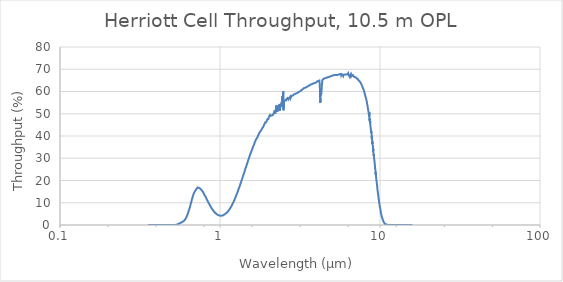
| Category | Throughput (%) |
|---|---|
| 0.355 | 0 |
| 0.365 | 0 |
| 0.375 | 0 |
| 0.385 | 0 |
| 0.395 | 0 |
| 0.405 | 0 |
| 0.415 | 0 |
| 0.425 | 0 |
| 0.435 | 0 |
| 0.445 | 0 |
| 0.455 | 0 |
| 0.465 | 0 |
| 0.475 | 0 |
| 0.485 | 0 |
| 0.495 | 0 |
| 0.505 | 0 |
| 0.515 | 0.002 |
| 0.525 | 0.031 |
| 0.535 | 0.14 |
| 0.545 | 0.35 |
| 0.555 | 0.617 |
| 0.565 | 0.894 |
| 0.575 | 1.171 |
| 0.585 | 1.481 |
| 0.595 | 1.883 |
| 0.605 | 2.477 |
| 0.615 | 3.335 |
| 0.625 | 4.483 |
| 0.635 | 5.9 |
| 0.645 | 7.512 |
| 0.655 | 9.22 |
| 0.665 | 10.995 |
| 0.675 | 12.688 |
| 0.685 | 14.096 |
| 0.695 | 14.979 |
| 0.705 | 15.73 |
| 0.715 | 16.127 |
| 0.725 | 16.89 |
| 0.735 | 16.753 |
| 0.745 | 16.546 |
| 0.755 | 16.311 |
| 0.765 | 15.822 |
| 0.775 | 15.239 |
| 0.785 | 14.701 |
| 0.795 | 13.931 |
| 0.805 | 13.139 |
| 0.815 | 12.527 |
| 0.825 | 11.699 |
| 0.835 | 10.95 |
| 0.845 | 10.209 |
| 0.855 | 9.512 |
| 0.865 | 8.82 |
| 0.875 | 8.225 |
| 0.885 | 7.606 |
| 0.895 | 7.089 |
| 0.905 | 6.58 |
| 0.915 | 6.14 |
| 0.925 | 5.75 |
| 0.935 | 5.394 |
| 0.945 | 5.085 |
| 0.955 | 4.828 |
| 0.965 | 4.617 |
| 0.975 | 4.452 |
| 0.985 | 4.326 |
| 0.995 | 4.242 |
| 1.005 | 4.181 |
| 1.015 | 4.166 |
| 1.025 | 4.184 |
| 1.035 | 4.219 |
| 1.045 | 4.318 |
| 1.055 | 4.609 |
| 1.065 | 4.746 |
| 1.075 | 4.923 |
| 1.085 | 5.125 |
| 1.095 | 5.35 |
| 1.105 | 5.607 |
| 1.115 | 5.902 |
| 1.125 | 6.212 |
| 1.135 | 6.617 |
| 1.145 | 7.002 |
| 1.155 | 7.391 |
| 1.165 | 7.841 |
| 1.175 | 8.292 |
| 1.185 | 8.799 |
| 1.195 | 9.324 |
| 1.205 | 9.877 |
| 1.215 | 10.403 |
| 1.225 | 10.954 |
| 1.235 | 11.48 |
| 1.245 | 12.135 |
| 1.255 | 12.787 |
| 1.265 | 13.429 |
| 1.275 | 14.004 |
| 1.285 | 14.664 |
| 1.295 | 15.378 |
| 1.305 | 16.025 |
| 1.315 | 16.696 |
| 1.325 | 17.288 |
| 1.335 | 17.999 |
| 1.345 | 18.711 |
| 1.355 | 19.321 |
| 1.365 | 20.124 |
| 1.375 | 20.7 |
| 1.385 | 21.493 |
| 1.395 | 22.303 |
| 1.405 | 22.748 |
| 1.415 | 23.447 |
| 1.425 | 24.099 |
| 1.435 | 24.889 |
| 1.445 | 25.581 |
| 1.455 | 26.1 |
| 1.465 | 26.801 |
| 1.475 | 27.467 |
| 1.485 | 28.038 |
| 1.495 | 28.786 |
| 1.505 | 29.348 |
| 1.515 | 29.931 |
| 1.525 | 30.647 |
| 1.535 | 31.094 |
| 1.545 | 31.713 |
| 1.555 | 32.141 |
| 1.565 | 32.878 |
| 1.575 | 33.106 |
| 1.585 | 33.778 |
| 1.595 | 34.276 |
| 1.605 | 35.043 |
| 1.615 | 35.122 |
| 1.625 | 35.779 |
| 1.635 | 36.249 |
| 1.645 | 36.573 |
| 1.655 | 37.429 |
| 1.665 | 37.652 |
| 1.675 | 37.72 |
| 1.685 | 38.638 |
| 1.695 | 38.591 |
| 1.705 | 39.022 |
| 1.715 | 39.441 |
| 1.725 | 40.033 |
| 1.735 | 40.137 |
| 1.745 | 40.683 |
| 1.755 | 41.013 |
| 1.765 | 41.536 |
| 1.775 | 41.844 |
| 1.785 | 42.045 |
| 1.795 | 42.28 |
| 1.805 | 42.497 |
| 1.815 | 42.706 |
| 1.825 | 42.772 |
| 1.835 | 43.385 |
| 1.845 | 43.613 |
| 1.855 | 43.903 |
| 1.865 | 44.225 |
| 1.875 | 44.589 |
| 1.885 | 44.631 |
| 1.895 | 45.298 |
| 1.905 | 45.165 |
| 1.915 | 46.052 |
| 1.925 | 46.426 |
| 1.935 | 46.071 |
| 1.945 | 46.173 |
| 1.955 | 46.478 |
| 1.965 | 46.474 |
| 1.975 | 47.49 |
| 1.985 | 47.084 |
| 1.995 | 47.652 |
| 2.005 | 47.608 |
| 2.015 | 48.159 |
| 2.025 | 48.671 |
| 2.035 | 48.735 |
| 2.045 | 49.045 |
| 2.055 | 49.522 |
| 2.065 | 49.286 |
| 2.075 | 49.312 |
| 2.085 | 49.068 |
| 2.095 | 49.488 |
| 2.105 | 49.417 |
| 2.115 | 49.344 |
| 2.125 | 49.272 |
| 2.135 | 49.58 |
| 2.145 | 49.29 |
| 2.155 | 49.842 |
| 2.165 | 50.169 |
| 2.175 | 49.792 |
| 2.185 | 50.789 |
| 2.195 | 51.398 |
| 2.205 | 51.053 |
| 2.215 | 50.07 |
| 2.225 | 51.731 |
| 2.235 | 51.045 |
| 2.245 | 50.768 |
| 2.255 | 53.727 |
| 2.265 | 50.956 |
| 2.275 | 52.141 |
| 2.285 | 51.089 |
| 2.295 | 52.728 |
| 2.305 | 52.562 |
| 2.315 | 53.229 |
| 2.325 | 51.937 |
| 2.335 | 52.761 |
| 2.345 | 53.357 |
| 2.355 | 54.118 |
| 2.365 | 51.442 |
| 2.375 | 52.176 |
| 2.385 | 54.454 |
| 2.395 | 54.749 |
| 2.405 | 54.561 |
| 2.415 | 53.223 |
| 2.425 | 53.392 |
| 2.435 | 55.285 |
| 2.445 | 53.714 |
| 2.455 | 57.946 |
| 2.465 | 55.768 |
| 2.475 | 57.915 |
| 2.485 | 60.158 |
| 2.495 | 51.623 |
| 2.505 | 55.692 |
| 2.515 | 55.685 |
| 2.525 | 55.687 |
| 2.535 | 56.004 |
| 2.545 | 55.945 |
| 2.555 | 56.029 |
| 2.565 | 56.153 |
| 2.575 | 56.142 |
| 2.585 | 55.974 |
| 2.595 | 56.533 |
| 2.61 | 56.21 |
| 2.619 | 56.486 |
| 2.63 | 56.752 |
| 2.64 | 57.015 |
| 2.65 | 56.878 |
| 2.659 | 56.94 |
| 2.67 | 56.41 |
| 2.68 | 55.963 |
| 2.689 | 56.376 |
| 2.7 | 57.015 |
| 2.71 | 57 |
| 2.719 | 57.432 |
| 2.73 | 57.027 |
| 2.739 | 56.779 |
| 2.749 | 57.702 |
| 2.76 | 57.012 |
| 2.769 | 57.293 |
| 2.78 | 57.525 |
| 2.789 | 57.447 |
| 2.8 | 57.928 |
| 2.809 | 58.07 |
| 2.82 | 57.976 |
| 2.829 | 58.137 |
| 2.839 | 58.211 |
| 2.849 | 58.301 |
| 2.859 | 58.252 |
| 2.87 | 58.409 |
| 2.879 | 58.498 |
| 2.889 | 58.624 |
| 2.899 | 58.613 |
| 2.909 | 58.736 |
| 2.919 | 58.688 |
| 2.929 | 58.766 |
| 2.939 | 58.863 |
| 2.949 | 58.779 |
| 2.959 | 58.955 |
| 2.969 | 59.175 |
| 2.979 | 59.074 |
| 2.989 | 59.137 |
| 2.999 | 59.149 |
| 3.009 | 59.188 |
| 3.019 | 59.325 |
| 3.029 | 59.228 |
| 3.039 | 59.356 |
| 3.049 | 59.472 |
| 3.059 | 59.415 |
| 3.069 | 59.553 |
| 3.079 | 59.53 |
| 3.089 | 59.662 |
| 3.099 | 59.73 |
| 3.109 | 59.788 |
| 3.119 | 59.94 |
| 3.129 | 59.894 |
| 3.139 | 59.974 |
| 3.149 | 60.016 |
| 3.159 | 60.084 |
| 3.169 | 60.184 |
| 3.179 | 60.305 |
| 3.189 | 60.261 |
| 3.199 | 60.218 |
| 3.209 | 60.4 |
| 3.219 | 60.511 |
| 3.229 | 60.594 |
| 3.239 | 60.655 |
| 3.249 | 60.787 |
| 3.259 | 60.874 |
| 3.269 | 60.848 |
| 3.279 | 60.975 |
| 3.289 | 60.977 |
| 3.299 | 61.068 |
| 3.309 | 61.148 |
| 3.319 | 61.138 |
| 3.329 | 61.212 |
| 3.339 | 61.271 |
| 3.349 | 61.429 |
| 3.359 | 61.594 |
| 3.369 | 61.488 |
| 3.379 | 61.506 |
| 3.389 | 61.631 |
| 3.399 | 61.623 |
| 3.409 | 61.652 |
| 3.419 | 61.649 |
| 3.429 | 61.608 |
| 3.439 | 61.802 |
| 3.449 | 61.829 |
| 3.459 | 61.956 |
| 3.469 | 62.012 |
| 3.479 | 62.163 |
| 3.489 | 62.092 |
| 3.499 | 62.146 |
| 3.509 | 62.173 |
| 3.519 | 62.229 |
| 3.529 | 62.121 |
| 3.539 | 62.293 |
| 3.549 | 62.478 |
| 3.559 | 62.586 |
| 3.569 | 62.454 |
| 3.579 | 62.537 |
| 3.589 | 62.554 |
| 3.599 | 62.573 |
| 3.609 | 62.64 |
| 3.619 | 62.784 |
| 3.629 | 62.821 |
| 3.639 | 62.786 |
| 3.649 | 62.941 |
| 3.659 | 62.912 |
| 3.669 | 62.917 |
| 3.679 | 62.918 |
| 3.689 | 63.105 |
| 3.699 | 63.185 |
| 3.709 | 63.217 |
| 3.719 | 63.281 |
| 3.729 | 63.408 |
| 3.739 | 63.321 |
| 3.749 | 63.247 |
| 3.759 | 63.3 |
| 3.769 | 63.465 |
| 3.779 | 63.384 |
| 3.789 | 63.475 |
| 3.799 | 63.483 |
| 3.809 | 63.576 |
| 3.819 | 63.548 |
| 3.829 | 63.654 |
| 3.839 | 63.628 |
| 3.849 | 63.701 |
| 3.859 | 63.8 |
| 3.869 | 63.738 |
| 3.879 | 63.815 |
| 3.889 | 63.829 |
| 3.899 | 63.956 |
| 3.909 | 63.997 |
| 3.919 | 63.954 |
| 3.929 | 63.83 |
| 3.939 | 63.88 |
| 3.949 | 63.923 |
| 3.959 | 64.061 |
| 3.968 | 64.146 |
| 3.979 | 64.196 |
| 3.989 | 64.105 |
| 3.999 | 64.15 |
| 4.009 | 64.27 |
| 4.018 | 64.267 |
| 4.029 | 64.469 |
| 4.039 | 64.391 |
| 4.049 | 64.409 |
| 4.058 | 64.583 |
| 4.069 | 64.571 |
| 4.078 | 64.566 |
| 4.089 | 64.475 |
| 4.098 | 64.59 |
| 4.109 | 64.623 |
| 4.118 | 64.735 |
| 4.129 | 64.794 |
| 4.138 | 64.884 |
| 4.148 | 64.825 |
| 4.159 | 64.989 |
| 4.168 | 64.928 |
| 4.178 | 64.923 |
| 4.189 | 64.532 |
| 4.198 | 63.471 |
| 4.208 | 61.988 |
| 4.218 | 60.317 |
| 4.228 | 55.672 |
| 4.238 | 54.973 |
| 4.248 | 56.489 |
| 4.258 | 59.579 |
| 4.268 | 58.262 |
| 4.278 | 58.218 |
| 4.288 | 58.511 |
| 4.298 | 59.424 |
| 4.308 | 60.246 |
| 4.318 | 61.047 |
| 4.328 | 62.56 |
| 4.338 | 63.37 |
| 4.348 | 63.9 |
| 4.358 | 64.941 |
| 4.368 | 65.204 |
| 4.378 | 65.274 |
| 4.388 | 65.416 |
| 4.398 | 65.657 |
| 4.408 | 65.565 |
| 4.418 | 65.541 |
| 4.428 | 65.6 |
| 4.438 | 65.636 |
| 4.448 | 65.697 |
| 4.458 | 65.764 |
| 4.468 | 65.881 |
| 4.478 | 65.82 |
| 4.488 | 65.765 |
| 4.498 | 65.858 |
| 4.508 | 65.886 |
| 4.518 | 65.943 |
| 4.528 | 65.984 |
| 4.538 | 66.009 |
| 4.548 | 66.014 |
| 4.558 | 65.95 |
| 4.568 | 66.076 |
| 4.578 | 66.055 |
| 4.588 | 66.085 |
| 4.598 | 66.064 |
| 4.608 | 66.042 |
| 4.618 | 66.08 |
| 4.628 | 66.155 |
| 4.638 | 66.144 |
| 4.648 | 66.319 |
| 4.658 | 66.38 |
| 4.668 | 66.267 |
| 4.678 | 66.25 |
| 4.688 | 66.263 |
| 4.698 | 66.32 |
| 4.708 | 66.28 |
| 4.718 | 66.355 |
| 4.728 | 66.432 |
| 4.738 | 66.492 |
| 4.748 | 66.514 |
| 4.758 | 66.512 |
| 4.768 | 66.637 |
| 4.778 | 66.627 |
| 4.788 | 66.547 |
| 4.798 | 66.633 |
| 4.808 | 66.558 |
| 4.818 | 66.597 |
| 4.828 | 66.645 |
| 4.838 | 66.687 |
| 4.848 | 66.659 |
| 4.858 | 66.654 |
| 4.868 | 66.756 |
| 4.878 | 66.749 |
| 4.888 | 66.749 |
| 4.898 | 66.73 |
| 4.908 | 66.899 |
| 4.918 | 66.889 |
| 4.928 | 66.861 |
| 4.938 | 66.927 |
| 4.948 | 66.94 |
| 4.958 | 66.915 |
| 4.968 | 66.937 |
| 4.978 | 66.95 |
| 4.988 | 66.97 |
| 4.998 | 66.914 |
| 5.008 | 66.875 |
| 5.018 | 66.946 |
| 5.028 | 66.995 |
| 5.038 | 67.185 |
| 5.048 | 67.191 |
| 5.058 | 67.165 |
| 5.068 | 67.156 |
| 5.078 | 67.066 |
| 5.088 | 67.094 |
| 5.098 | 67.187 |
| 5.107 | 67.323 |
| 5.118 | 67.258 |
| 5.128 | 67.21 |
| 5.138 | 67.248 |
| 5.147 | 67.155 |
| 5.158 | 67.217 |
| 5.168 | 67.27 |
| 5.178 | 67.287 |
| 5.187 | 67.404 |
| 5.198 | 67.426 |
| 5.208 | 67.292 |
| 5.218 | 67.369 |
| 5.227 | 67.414 |
| 5.238 | 67.388 |
| 5.248 | 67.452 |
| 5.257 | 67.469 |
| 5.268 | 67.418 |
| 5.278 | 67.39 |
| 5.288 | 67.392 |
| 5.297 | 67.387 |
| 5.308 | 67.557 |
| 5.318 | 67.543 |
| 5.327 | 67.539 |
| 5.337 | 67.593 |
| 5.348 | 67.39 |
| 5.358 | 67.378 |
| 5.367 | 67.527 |
| 5.378 | 67.689 |
| 5.388 | 67.699 |
| 5.397 | 67.664 |
| 5.407 | 67.548 |
| 5.418 | 67.437 |
| 5.428 | 67.325 |
| 5.437 | 67.425 |
| 5.448 | 67.668 |
| 5.458 | 67.628 |
| 5.467 | 67.443 |
| 5.477 | 67.438 |
| 5.488 | 67.549 |
| 5.497 | 67.652 |
| 5.507 | 67.695 |
| 5.518 | 67.641 |
| 5.527 | 67.687 |
| 5.537 | 67.799 |
| 5.548 | 67.703 |
| 5.558 | 67.603 |
| 5.567 | 67.66 |
| 5.578 | 67.556 |
| 5.588 | 67.66 |
| 5.597 | 67.809 |
| 5.608 | 67.815 |
| 5.618 | 67.824 |
| 5.627 | 67.882 |
| 5.637 | 67.832 |
| 5.648 | 67.528 |
| 5.657 | 67.599 |
| 5.667 | 67.732 |
| 5.678 | 67.762 |
| 5.687 | 67.737 |
| 5.697 | 67.849 |
| 5.707 | 67.848 |
| 5.717 | 67.337 |
| 5.727 | 67.422 |
| 5.737 | 67.617 |
| 5.747 | 67.798 |
| 5.758 | 67.835 |
| 5.767 | 67.643 |
| 5.777 | 67.435 |
| 5.788 | 67.772 |
| 5.797 | 67.933 |
| 5.807 | 68.037 |
| 5.818 | 67.71 |
| 5.827 | 67.416 |
| 5.837 | 67.506 |
| 5.847 | 67.897 |
| 5.857 | 67.833 |
| 5.867 | 67.678 |
| 5.877 | 67.492 |
| 5.887 | 67.013 |
| 5.898 | 67.177 |
| 5.907 | 67.491 |
| 5.917 | 67.689 |
| 5.927 | 67.608 |
| 5.937 | 67.347 |
| 5.947 | 67.178 |
| 5.957 | 67.632 |
| 5.967 | 67.726 |
| 5.978 | 67.715 |
| 5.987 | 67.567 |
| 5.997 | 67.588 |
| 6.007 | 67.684 |
| 6.017 | 67.654 |
| 6.027 | 67.825 |
| 6.037 | 68 |
| 6.047 | 67.854 |
| 6.057 | 67.244 |
| 6.067 | 67.209 |
| 6.077 | 67.23 |
| 6.087 | 67.675 |
| 6.097 | 67.794 |
| 6.107 | 67.685 |
| 6.117 | 67.362 |
| 6.127 | 67.451 |
| 6.137 | 67.569 |
| 6.147 | 67.542 |
| 6.157 | 67.42 |
| 6.167 | 67.532 |
| 6.177 | 67.674 |
| 6.187 | 67.572 |
| 6.197 | 67.603 |
| 6.207 | 67.664 |
| 6.217 | 67.666 |
| 6.227 | 67.729 |
| 6.237 | 67.801 |
| 6.247 | 67.87 |
| 6.257 | 67.884 |
| 6.267 | 67.751 |
| 6.277 | 67.606 |
| 6.287 | 67.555 |
| 6.297 | 67.706 |
| 6.307 | 67.908 |
| 6.317 | 68.154 |
| 6.327 | 68.206 |
| 6.337 | 67.919 |
| 6.347 | 67.609 |
| 6.357 | 67.692 |
| 6.367 | 67.693 |
| 6.377 | 67.632 |
| 6.387 | 67.695 |
| 6.397 | 67.955 |
| 6.407 | 67.765 |
| 6.417 | 67.194 |
| 6.427 | 66.952 |
| 6.437 | 67.149 |
| 6.446 | 67.336 |
| 6.457 | 67.638 |
| 6.467 | 67.648 |
| 6.477 | 67.514 |
| 6.487 | 67.243 |
| 6.497 | 66.966 |
| 6.507 | 67.129 |
| 6.517 | 67.247 |
| 6.527 | 67.339 |
| 6.537 | 67.428 |
| 6.547 | 67.442 |
| 6.557 | 67.357 |
| 6.567 | 67.02 |
| 6.577 | 66.869 |
| 6.587 | 66.862 |
| 6.597 | 67.158 |
| 6.607 | 67.326 |
| 6.617 | 67.403 |
| 6.627 | 67.009 |
| 6.637 | 66.716 |
| 6.647 | 66.823 |
| 6.657 | 67.114 |
| 6.666 | 67.358 |
| 6.677 | 67.298 |
| 6.686 | 67.286 |
| 6.697 | 67.343 |
| 6.706 | 67.209 |
| 6.717 | 67.043 |
| 6.726 | 67.094 |
| 6.737 | 67.47 |
| 6.746 | 67.549 |
| 6.757 | 67.554 |
| 6.766 | 67.399 |
| 6.777 | 67.216 |
| 6.787 | 67.028 |
| 6.797 | 67.164 |
| 6.807 | 67.314 |
| 6.816 | 67.368 |
| 6.827 | 67.305 |
| 6.836 | 67.217 |
| 6.847 | 67.181 |
| 6.856 | 66.971 |
| 6.867 | 66.661 |
| 6.876 | 66.78 |
| 6.887 | 66.951 |
| 6.897 | 67.012 |
| 6.906 | 66.88 |
| 6.917 | 66.836 |
| 6.926 | 66.853 |
| 6.937 | 66.944 |
| 6.946 | 66.863 |
| 6.956 | 66.685 |
| 6.967 | 66.482 |
| 6.976 | 66.534 |
| 6.987 | 66.583 |
| 6.996 | 66.558 |
| 7.007 | 66.504 |
| 7.016 | 66.457 |
| 7.026 | 66.387 |
| 7.037 | 66.237 |
| 7.046 | 66.146 |
| 7.057 | 66.103 |
| 7.066 | 66.26 |
| 7.076 | 66.299 |
| 7.087 | 66.294 |
| 7.096 | 66.251 |
| 7.107 | 66.161 |
| 7.116 | 66.133 |
| 7.126 | 66.115 |
| 7.137 | 66.036 |
| 7.146 | 65.913 |
| 7.156 | 65.828 |
| 7.166 | 65.801 |
| 7.176 | 65.911 |
| 7.187 | 65.93 |
| 7.196 | 65.904 |
| 7.206 | 65.776 |
| 7.217 | 65.755 |
| 7.226 | 65.779 |
| 7.236 | 65.865 |
| 7.246 | 65.806 |
| 7.256 | 65.713 |
| 7.266 | 65.608 |
| 7.276 | 65.523 |
| 7.286 | 65.543 |
| 7.296 | 65.579 |
| 7.306 | 65.616 |
| 7.316 | 65.51 |
| 7.327 | 65.369 |
| 7.336 | 65.204 |
| 7.346 | 65.04 |
| 7.357 | 65.011 |
| 7.366 | 65.019 |
| 7.376 | 65.073 |
| 7.386 | 65.072 |
| 7.396 | 65.09 |
| 7.406 | 65.113 |
| 7.416 | 65.047 |
| 7.426 | 64.965 |
| 7.436 | 64.875 |
| 7.446 | 64.722 |
| 7.456 | 64.555 |
| 7.466 | 64.399 |
| 7.476 | 64.337 |
| 7.486 | 64.377 |
| 7.496 | 64.396 |
| 7.506 | 64.387 |
| 7.516 | 64.291 |
| 7.526 | 64.192 |
| 7.536 | 64.115 |
| 7.546 | 64.094 |
| 7.556 | 64.041 |
| 7.566 | 63.965 |
| 7.576 | 63.879 |
| 7.586 | 63.807 |
| 7.596 | 63.733 |
| 7.606 | 63.654 |
| 7.616 | 63.559 |
| 7.626 | 63.462 |
| 7.636 | 63.373 |
| 7.646 | 63.329 |
| 7.656 | 63.263 |
| 7.666 | 63.151 |
| 7.676 | 62.983 |
| 7.686 | 62.877 |
| 7.696 | 62.809 |
| 7.706 | 62.755 |
| 7.716 | 62.729 |
| 7.726 | 62.628 |
| 7.736 | 62.498 |
| 7.746 | 62.326 |
| 7.756 | 62.214 |
| 7.766 | 62.112 |
| 7.776 | 62.024 |
| 7.786 | 61.919 |
| 7.796 | 61.802 |
| 7.806 | 61.675 |
| 7.816 | 61.554 |
| 7.826 | 61.473 |
| 7.836 | 61.406 |
| 7.846 | 61.398 |
| 7.855 | 61.328 |
| 7.866 | 61.236 |
| 7.876 | 61.132 |
| 7.886 | 60.977 |
| 7.896 | 60.793 |
| 7.905 | 60.616 |
| 7.916 | 60.421 |
| 7.926 | 60.28 |
| 7.936 | 60.161 |
| 7.946 | 60.055 |
| 7.955 | 60.005 |
| 7.966 | 59.9 |
| 7.976 | 59.78 |
| 7.986 | 59.671 |
| 7.996 | 59.54 |
| 8.005 | 59.404 |
| 8.016 | 59.224 |
| 8.026 | 59.058 |
| 8.036 | 58.895 |
| 8.046 | 58.744 |
| 8.056 | 58.613 |
| 8.065 | 58.49 |
| 8.075 | 58.362 |
| 8.086 | 58.231 |
| 8.096 | 58.055 |
| 8.106 | 57.871 |
| 8.116 | 57.686 |
| 8.125 | 57.55 |
| 8.135 | 57.418 |
| 8.146 | 57.294 |
| 8.156 | 57.233 |
| 8.166 | 57.107 |
| 8.176 | 56.98 |
| 8.186 | 56.85 |
| 8.195 | 56.698 |
| 8.205 | 56.548 |
| 8.215 | 56.38 |
| 8.226 | 56.162 |
| 8.236 | 55.928 |
| 8.246 | 55.691 |
| 8.256 | 55.531 |
| 8.266 | 55.383 |
| 8.275 | 55.232 |
| 8.285 | 55.065 |
| 8.295 | 54.834 |
| 8.305 | 54.587 |
| 8.315 | 54.352 |
| 8.326 | 54.131 |
| 8.336 | 53.923 |
| 8.346 | 53.728 |
| 8.356 | 53.516 |
| 8.366 | 53.271 |
| 8.375 | 53.055 |
| 8.385 | 52.806 |
| 8.395 | 52.586 |
| 8.405 | 52.378 |
| 8.415 | 52.183 |
| 8.425 | 52.014 |
| 8.435 | 51.784 |
| 8.445 | 51.553 |
| 8.455 | 51.275 |
| 8.465 | 51.039 |
| 8.476 | 50.786 |
| 8.486 | 50.545 |
| 8.496 | 50.317 |
| 8.506 | 50.086 |
| 8.516 | 50.191 |
| 8.526 | 50.265 |
| 8.536 | 49.365 |
| 8.555 | 48.904 |
| 8.565 | 50.666 |
| 8.575 | 48.77 |
| 8.585 | 48.494 |
| 8.595 | 47.761 |
| 8.605 | 47.39 |
| 8.615 | 46.991 |
| 8.625 | 47.887 |
| 8.635 | 46.948 |
| 8.645 | 46.279 |
| 8.655 | 45.703 |
| 8.665 | 46.161 |
| 8.675 | 46.808 |
| 8.685 | 46.282 |
| 8.695 | 45.426 |
| 8.705 | 44.888 |
| 8.715 | 45.153 |
| 8.735 | 43.926 |
| 8.745 | 43.53 |
| 8.755 | 43.332 |
| 8.765 | 43.589 |
| 8.775 | 42.848 |
| 8.785 | 42.623 |
| 8.795 | 42.364 |
| 8.805 | 41.356 |
| 8.815 | 42.025 |
| 8.825 | 41.724 |
| 8.835 | 41.55 |
| 8.845 | 41.631 |
| 8.855 | 41.813 |
| 8.865 | 40.604 |
| 8.875 | 39.854 |
| 8.885 | 38.945 |
| 8.895 | 39.79 |
| 8.905 | 38.778 |
| 8.925 | 38.572 |
| 8.935 | 37.9 |
| 8.945 | 38.168 |
| 8.955 | 36.475 |
| 8.965 | 37.433 |
| 8.975 | 37.62 |
| 8.985 | 36.488 |
| 8.995 | 35.915 |
| 9.005 | 36.071 |
| 9.015 | 35.686 |
| 9.035 | 35.418 |
| 9.045 | 34.972 |
| 9.055 | 34.245 |
| 9.065 | 33.606 |
| 9.075 | 34.129 |
| 9.085 | 32.803 |
| 9.095 | 33.179 |
| 9.115 | 31.851 |
| 9.125 | 32.211 |
| 9.135 | 31.802 |
| 9.145 | 31.09 |
| 9.155 | 31.711 |
| 9.175 | 30.494 |
| 9.185 | 30.704 |
| 9.195 | 29.652 |
| 9.205 | 29.376 |
| 9.215 | 29.123 |
| 9.235 | 28.87 |
| 9.245 | 28.698 |
| 9.255 | 28.071 |
| 9.265 | 27.876 |
| 9.275 | 27.293 |
| 9.295 | 26.682 |
| 9.305 | 25.901 |
| 9.314 | 25.877 |
| 9.325 | 25.397 |
| 9.345 | 25.073 |
| 9.355 | 24.811 |
| 9.364 | 24.732 |
| 9.375 | 23.691 |
| 9.385 | 23.993 |
| 9.395 | 23.202 |
| 9.404 | 23.086 |
| 9.415 | 23.659 |
| 9.425 | 22.438 |
| 9.435 | 22.774 |
| 9.444 | 22.304 |
| 9.455 | 22.119 |
| 9.465 | 21.202 |
| 9.475 | 20.657 |
| 9.484 | 20.757 |
| 9.495 | 20.165 |
| 9.505 | 20.276 |
| 9.515 | 19.846 |
| 9.524 | 20.352 |
| 9.535 | 19.438 |
| 9.545 | 19.592 |
| 9.554 | 19.131 |
| 9.564 | 18.445 |
| 9.575 | 18.098 |
| 9.585 | 18.071 |
| 9.594 | 17.675 |
| 9.605 | 17.108 |
| 9.615 | 17.03 |
| 9.624 | 16.373 |
| 9.634 | 16.267 |
| 9.645 | 15.75 |
| 9.654 | 15.881 |
| 9.664 | 16.055 |
| 9.675 | 15.217 |
| 9.684 | 15.506 |
| 9.694 | 14.677 |
| 9.705 | 14.611 |
| 9.714 | 14.595 |
| 9.724 | 14.103 |
| 9.735 | 13.636 |
| 9.744 | 13.211 |
| 9.754 | 13.635 |
| 9.765 | 13.08 |
| 9.774 | 12.722 |
| 9.784 | 12.474 |
| 9.795 | 11.96 |
| 9.804 | 12.213 |
| 9.815 | 11.814 |
| 9.824 | 11.528 |
| 9.834 | 11.534 |
| 9.845 | 11.263 |
| 9.854 | 11.088 |
| 9.864 | 10.564 |
| 9.875 | 10.109 |
| 9.884 | 10.279 |
| 9.895 | 9.852 |
| 9.904 | 9.805 |
| 9.914 | 9.822 |
| 9.924 | 9.346 |
| 9.934 | 9.162 |
| 9.945 | 8.88 |
| 9.954 | 8.775 |
| 9.964 | 8.287 |
| 9.974 | 8.224 |
| 9.984 | 7.916 |
| 9.994 | 8.038 |
| 10.004 | 8.001 |
| 10.015 | 7.728 |
| 10.024 | 7.896 |
| 10.034 | 7.344 |
| 10.044 | 7.437 |
| 10.054 | 7.134 |
| 10.064 | 6.775 |
| 10.074 | 6.683 |
| 10.084 | 6.53 |
| 10.094 | 6.228 |
| 10.104 | 6.249 |
| 10.114 | 5.649 |
| 10.124 | 5.881 |
| 10.134 | 5.623 |
| 10.144 | 5.464 |
| 10.154 | 5.187 |
| 10.164 | 5.259 |
| 10.174 | 5.124 |
| 10.184 | 5.177 |
| 10.194 | 4.663 |
| 10.204 | 4.666 |
| 10.214 | 4.514 |
| 10.224 | 4.357 |
| 10.234 | 4.14 |
| 10.244 | 3.947 |
| 10.254 | 4.088 |
| 10.264 | 3.996 |
| 10.274 | 3.675 |
| 10.284 | 3.731 |
| 10.294 | 3.705 |
| 10.304 | 3.419 |
| 10.314 | 3.249 |
| 10.324 | 3.258 |
| 10.334 | 3.177 |
| 10.344 | 2.941 |
| 10.354 | 2.89 |
| 10.364 | 2.695 |
| 10.374 | 2.834 |
| 10.384 | 2.717 |
| 10.394 | 2.558 |
| 10.404 | 2.427 |
| 10.414 | 2.579 |
| 10.424 | 2.273 |
| 10.434 | 2.265 |
| 10.444 | 2.089 |
| 10.454 | 1.983 |
| 10.464 | 1.997 |
| 10.474 | 1.935 |
| 10.484 | 1.918 |
| 10.494 | 1.716 |
| 10.504 | 1.627 |
| 10.514 | 1.689 |
| 10.524 | 1.661 |
| 10.534 | 1.488 |
| 10.544 | 1.42 |
| 10.554 | 1.437 |
| 10.564 | 1.202 |
| 10.574 | 1.23 |
| 10.584 | 1.25 |
| 10.594 | 1.22 |
| 10.604 | 1.05 |
| 10.614 | 0.971 |
| 10.624 | 1.102 |
| 10.634 | 1.056 |
| 10.644 | 0.941 |
| 10.654 | 0.941 |
| 10.664 | 0.838 |
| 10.674 | 0.901 |
| 10.684 | 0.766 |
| 10.694 | 0.708 |
| 10.704 | 0.741 |
| 10.714 | 0.776 |
| 10.723 | 0.632 |
| 10.734 | 0.535 |
| 10.744 | 0.553 |
| 10.754 | 0.506 |
| 10.763 | 0.537 |
| 10.774 | 0.565 |
| 10.784 | 0.424 |
| 10.794 | 0.491 |
| 10.803 | 0.401 |
| 10.814 | 0.399 |
| 10.824 | 0.347 |
| 10.834 | 0.364 |
| 10.843 | 0.371 |
| 10.854 | 0.333 |
| 10.864 | 0.269 |
| 10.874 | 0.254 |
| 10.883 | 0.29 |
| 10.893 | 0.326 |
| 10.904 | 0.222 |
| 10.914 | 0.261 |
| 10.924 | 0.212 |
| 10.933 | 0.2 |
| 10.943 | 0.19 |
| 10.954 | 0.181 |
| 10.964 | 0.172 |
| 10.974 | 0.163 |
| 10.984 | 0.155 |
| 10.993 | 0.148 |
| 11.003 | 0.14 |
| 11.014 | 0.133 |
| 11.024 | 0.126 |
| 11.034 | 0.12 |
| 11.044 | 0.113 |
| 11.053 | 0.108 |
| 11.063 | 0.102 |
| 11.073 | 0.097 |
| 11.083 | 0.091 |
| 11.094 | 0.086 |
| 11.104 | 0.082 |
| 11.114 | 0.077 |
| 11.124 | 0.073 |
| 11.133 | 0.069 |
| 11.143 | 0.066 |
| 11.153 | 0.062 |
| 11.163 | 0.059 |
| 11.173 | 0.055 |
| 11.183 | 0.052 |
| 11.193 | 0.049 |
| 11.204 | 0.046 |
| 11.214 | 0.044 |
| 11.224 | 0.041 |
| 11.234 | 0.038 |
| 11.244 | 0.036 |
| 11.254 | 0.034 |
| 11.264 | 0.032 |
| 11.273 | 0.03 |
| 11.283 | 0.028 |
| 11.293 | 0.027 |
| 11.303 | 0.025 |
| 11.313 | 0.024 |
| 11.323 | 0.022 |
| 11.333 | 0.021 |
| 11.343 | 0.019 |
| 11.353 | 0.018 |
| 11.363 | 0.017 |
| 11.373 | 0.016 |
| 11.383 | 0.015 |
| 11.393 | 0.014 |
| 11.403 | 0.013 |
| 11.413 | 0.012 |
| 11.423 | 0.011 |
| 11.433 | 0.011 |
| 11.443 | 0.01 |
| 11.453 | 0.009 |
| 11.464 | 0.008 |
| 11.474 | 0.008 |
| 11.483 | 0.007 |
| 11.493 | 0.007 |
| 11.503 | 0.006 |
| 11.513 | 0.006 |
| 11.523 | 0.005 |
| 11.533 | 0.005 |
| 11.543 | 0.005 |
| 11.553 | 0.004 |
| 11.563 | 0.004 |
| 11.573 | 0.004 |
| 11.583 | 0.003 |
| 11.593 | 0.003 |
| 11.603 | 0.003 |
| 11.613 | 0.003 |
| 11.623 | 0.002 |
| 11.633 | 0.002 |
| 11.643 | 0.002 |
| 11.653 | 0.002 |
| 11.663 | 0.002 |
| 11.673 | 0.001 |
| 11.683 | 0.001 |
| 11.693 | 0.001 |
| 11.703 | 0.001 |
| 11.713 | 0.001 |
| 11.723 | 0.001 |
| 11.733 | 0.001 |
| 11.743 | 0.001 |
| 11.753 | 0.001 |
| 11.763 | 0.001 |
| 11.773 | 0.001 |
| 11.783 | 0 |
| 11.793 | 0 |
| 11.803 | 0 |
| 11.813 | 0 |
| 11.823 | 0 |
| 11.833 | 0 |
| 11.843 | 0 |
| 11.853 | 0 |
| 11.863 | 0 |
| 11.873 | 0 |
| 11.883 | 0 |
| 11.893 | 0 |
| 11.903 | 0 |
| 11.913 | 0 |
| 11.923 | 0 |
| 11.933 | 0 |
| 11.943 | 0 |
| 11.953 | 0 |
| 11.963 | 0 |
| 11.973 | 0 |
| 11.983 | 0 |
| 11.993 | 0 |
| 12.003 | 0 |
| 12.013 | 0 |
| 12.023 | 0 |
| 12.033 | 0 |
| 12.043 | 0 |
| 12.053 | 0 |
| 12.063 | 0 |
| 12.073 | 0 |
| 12.083 | 0 |
| 12.093 | 0 |
| 12.103 | 0 |
| 12.113 | 0 |
| 12.122 | 0 |
| 12.133 | 0 |
| 12.143 | 0 |
| 12.153 | 0 |
| 12.163 | 0 |
| 12.172 | 0 |
| 12.183 | 0 |
| 12.193 | 0 |
| 12.203 | 0 |
| 12.213 | 0 |
| 12.223 | 0 |
| 12.233 | 0 |
| 12.242 | 0 |
| 12.253 | 0 |
| 12.262 | 0 |
| 12.273 | 0 |
| 12.282 | 0 |
| 12.293 | 0 |
| 12.302 | 0 |
| 12.313 | 0 |
| 12.323 | 0 |
| 12.333 | 0 |
| 12.342 | 0 |
| 12.353 | 0 |
| 12.362 | 0 |
| 12.373 | 0 |
| 12.382 | 0 |
| 12.393 | 0 |
| 12.402 | 0 |
| 12.413 | 0 |
| 12.422 | 0 |
| 12.433 | 0 |
| 12.442 | 0 |
| 12.452 | 0 |
| 12.463 | 0 |
| 12.472 | 0 |
| 12.483 | 0 |
| 12.492 | 0 |
| 12.503 | 0 |
| 12.513 | 0 |
| 12.522 | 0 |
| 12.533 | 0 |
| 12.542 | 0 |
| 12.552 | 0 |
| 12.563 | 0 |
| 12.572 | 0 |
| 12.583 | 0 |
| 12.593 | 0 |
| 12.602 | 0 |
| 12.613 | 0 |
| 12.622 | 0 |
| 12.632 | 0 |
| 12.643 | 0 |
| 12.653 | 0 |
| 12.662 | 0 |
| 12.672 | 0 |
| 12.683 | 0 |
| 12.692 | 0 |
| 12.702 | 0 |
| 12.713 | 0 |
| 12.722 | 0 |
| 12.732 | 0 |
| 12.742 | 0 |
| 12.753 | 0 |
| 12.762 | 0 |
| 12.772 | 0 |
| 12.782 | 0 |
| 12.793 | 0 |
| 12.802 | 0 |
| 12.812 | 0 |
| 12.822 | 0 |
| 12.832 | 0 |
| 12.843 | 0 |
| 12.852 | 0 |
| 12.862 | 0 |
| 12.872 | 0 |
| 12.882 | 0 |
| 12.892 | 0 |
| 12.902 | 0 |
| 12.912 | 0 |
| 12.922 | 0 |
| 12.932 | 0 |
| 12.942 | 0 |
| 12.952 | 0 |
| 12.962 | 0 |
| 12.972 | 0 |
| 12.982 | 0 |
| 12.992 | 0 |
| 13.002 | 0 |
| 13.012 | 0 |
| 13.022 | 0 |
| 13.032 | 0 |
| 13.042 | 0 |
| 13.052 | 0 |
| 13.062 | 0 |
| 13.072 | 0 |
| 13.082 | 0 |
| 13.092 | 0 |
| 13.102 | 0 |
| 13.112 | 0 |
| 13.122 | 0 |
| 13.132 | 0 |
| 13.142 | 0 |
| 13.152 | 0 |
| 13.162 | 0 |
| 13.172 | 0 |
| 13.182 | 0 |
| 13.192 | 0 |
| 13.202 | 0 |
| 13.212 | 0 |
| 13.222 | 0 |
| 13.232 | 0 |
| 13.242 | 0 |
| 13.252 | 0 |
| 13.262 | 0 |
| 13.272 | 0 |
| 13.282 | 0 |
| 13.292 | 0 |
| 13.302 | 0 |
| 13.312 | 0 |
| 13.322 | 0 |
| 13.332 | 0 |
| 13.342 | 0 |
| 13.352 | 0 |
| 13.362 | 0 |
| 13.372 | 0 |
| 13.382 | 0 |
| 13.392 | 0 |
| 13.402 | 0 |
| 13.412 | 0 |
| 13.422 | 0 |
| 13.432 | 0 |
| 13.442 | 0 |
| 13.452 | 0 |
| 13.462 | 0 |
| 13.472 | 0 |
| 13.482 | 0 |
| 13.492 | 0 |
| 13.502 | 0 |
| 13.512 | 0 |
| 13.522 | 0 |
| 13.532 | 0 |
| 13.542 | 0 |
| 13.551 | 0 |
| 13.562 | 0 |
| 13.572 | 0 |
| 13.582 | 0 |
| 13.592 | 0 |
| 13.602 | 0 |
| 13.612 | 0 |
| 13.621 | 0 |
| 13.632 | 0 |
| 13.642 | 0 |
| 13.651 | 0 |
| 13.662 | 0 |
| 13.672 | 0 |
| 13.682 | 0 |
| 13.692 | 0 |
| 13.701 | 0 |
| 13.712 | 0 |
| 13.722 | 0 |
| 13.731 | 0 |
| 13.742 | 0 |
| 13.751 | 0 |
| 13.762 | 0 |
| 13.772 | 0 |
| 13.782 | 0 |
| 13.792 | 0 |
| 13.801 | 0 |
| 13.812 | 0 |
| 13.821 | 0 |
| 13.832 | 0 |
| 13.841 | 0 |
| 13.852 | 0 |
| 13.861 | 0 |
| 13.872 | 0 |
| 13.881 | 0 |
| 13.892 | 0 |
| 13.901 | 0 |
| 13.912 | 0 |
| 13.921 | 0 |
| 13.932 | 0 |
| 13.941 | 0 |
| 13.951 | 0 |
| 13.962 | 0 |
| 13.971 | 0 |
| 13.982 | 0 |
| 13.991 | 0 |
| 14.001 | 0 |
| 14.012 | 0 |
| 14.021 | 0 |
| 14.032 | 0 |
| 14.041 | 0 |
| 14.051 | 0 |
| 14.062 | 0 |
| 14.071 | 0 |
| 14.081 | 0 |
| 14.092 | 0 |
| 14.101 | 0 |
| 14.111 | 0 |
| 14.122 | 0 |
| 14.131 | 0 |
| 14.141 | 0 |
| 14.151 | 0 |
| 14.162 | 0 |
| 14.171 | 0 |
| 14.181 | 0 |
| 14.191 | 0 |
| 14.202 | 0 |
| 14.211 | 0 |
| 14.221 | 0 |
| 14.231 | 0 |
| 14.241 | 0 |
| 14.251 | 0 |
| 14.261 | 0 |
| 14.271 | 0 |
| 14.281 | 0 |
| 14.291 | 0 |
| 14.301 | 0 |
| 14.311 | 0 |
| 14.321 | 0 |
| 14.331 | 0 |
| 14.341 | 0 |
| 14.351 | 0 |
| 14.361 | 0 |
| 14.371 | 0 |
| 14.381 | 0 |
| 14.391 | 0 |
| 14.401 | 0 |
| 14.411 | 0 |
| 14.421 | 0 |
| 14.431 | 0 |
| 14.441 | 0 |
| 14.451 | 0 |
| 14.461 | 0 |
| 14.471 | 0 |
| 14.481 | 0 |
| 14.491 | 0 |
| 14.501 | 0 |
| 14.511 | 0 |
| 14.521 | 0 |
| 14.531 | 0 |
| 14.541 | 0 |
| 14.551 | 0 |
| 14.561 | 0 |
| 14.571 | 0 |
| 14.581 | 0 |
| 14.591 | 0 |
| 14.601 | 0 |
| 14.611 | 0 |
| 14.621 | 0 |
| 14.631 | 0 |
| 14.641 | 0 |
| 14.651 | 0 |
| 14.661 | 0 |
| 14.671 | 0 |
| 14.681 | 0 |
| 14.691 | 0 |
| 14.701 | 0 |
| 14.711 | 0 |
| 14.721 | 0 |
| 14.731 | 0 |
| 14.741 | 0 |
| 14.751 | 0 |
| 14.761 | 0 |
| 14.771 | 0 |
| 14.781 | 0 |
| 14.791 | 0 |
| 14.801 | 0 |
| 14.811 | 0 |
| 14.821 | 0 |
| 14.831 | 0 |
| 14.841 | 0 |
| 14.851 | 0 |
| 14.861 | 0 |
| 14.871 | 0 |
| 14.881 | 0 |
| 14.891 | 0 |
| 14.901 | 0 |
| 14.911 | 0 |
| 14.921 | 0 |
| 14.931 | 0 |
| 14.941 | 0 |
| 14.951 | 0 |
| 14.96 | 0 |
| 14.971 | 0 |
| 14.981 | 0 |
| 14.991 | 0 |
| 15.001 | 0 |
| 15.011 | 0 |
| 15.021 | 0 |
| 15.031 | 0 |
| 15.041 | 0 |
| 15.051 | 0 |
| 15.06 | 0 |
| 15.071 | 0 |
| 15.08 | 0 |
| 15.091 | 0 |
| 15.101 | 0 |
| 15.111 | 0 |
| 15.121 | 0 |
| 15.13 | 0 |
| 15.141 | 0 |
| 15.151 | 0 |
| 15.161 | 0 |
| 15.171 | 0 |
| 15.18 | 0 |
| 15.191 | 0 |
| 15.201 | 0 |
| 15.21 | 0 |
| 15.22 | 0 |
| 15.231 | 0 |
| 15.241 | 0 |
| 15.25 | 0 |
| 15.261 | 0 |
| 15.271 | 0 |
| 15.281 | 0 |
| 15.29 | 0 |
| 15.3 | 0 |
| 15.311 | 0 |
| 15.321 | 0 |
| 15.33 | 0 |
| 15.34 | 0 |
| 15.35 | 0 |
| 15.36 | 0 |
| 15.371 | 0 |
| 15.381 | 0 |
| 15.391 | 0 |
| 15.4 | 0 |
| 15.41 | 0 |
| 15.42 | 0 |
| 15.43 | 0 |
| 15.44 | 0 |
| 15.45 | 0 |
| 15.46 | 0 |
| 15.47 | 0 |
| 15.48 | 0 |
| 15.49 | 0 |
| 15.5 | 0 |
| 15.51 | 0 |
| 15.52 | 0 |
| 15.53 | 0 |
| 15.54 | 0 |
| 15.55 | 0 |
| 15.56 | 0 |
| 15.57 | 0 |
| 15.58 | 0 |
| 15.59 | 0 |
| 15.6 | 0 |
| 15.61 | 0 |
| 15.621 | 0 |
| 15.63 | 0 |
| 15.64 | 0 |
| 15.65 | 0 |
| 15.66 | 0 |
| 15.67 | 0 |
| 15.68 | 0 |
| 15.69 | 0 |
| 15.7 | 0 |
| 15.71 | 0 |
| 15.72 | 0 |
| 15.73 | 0 |
| 15.74 | 0 |
| 15.75 | 0 |
| 15.76 | 0 |
| 15.77 | 0 |
| 15.78 | 0 |
| 15.79 | 0 |
| 15.8 | 0 |
| 15.81 | 0 |
| 15.82 | 0 |
| 15.83 | 0.001 |
| 15.84 | 0.001 |
| 15.85 | 0.001 |
| 15.86 | 0.001 |
| 15.87 | 0.001 |
| 15.88 | 0.001 |
| 15.89 | 0.001 |
| 15.9 | 0.001 |
| 15.91 | 0.001 |
| 15.92 | 0.001 |
| 15.93 | 0.001 |
| 15.94 | 0.002 |
| 15.95 | 0.002 |
| 15.96 | 0.002 |
| 15.97 | 0.002 |
| 15.98 | 0.002 |
| 15.99 | 0.002 |
| 16.0 | 0.003 |